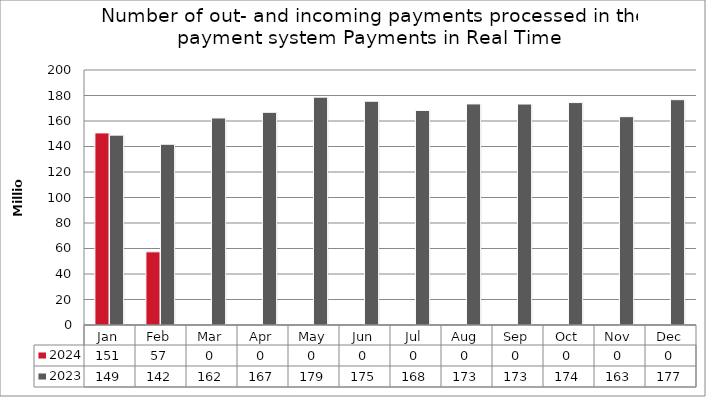
| Category | <fMaxÅr> | <fFgÅr> |
|---|---|---|
| Jan | 0 | 0 |
| Feb | 0 | 0 |
| Mar | 0 | 0 |
| Apr | 0 | 0 |
| May | 0 | 0 |
| Jun | 0 | 0 |
| Jul | 0 | 0 |
| Aug | 0 | 0 |
| Sep | 0 | 0 |
| Oct | 0 | 0 |
| Nov | 0 | 0 |
| Dec | 0 | 0 |